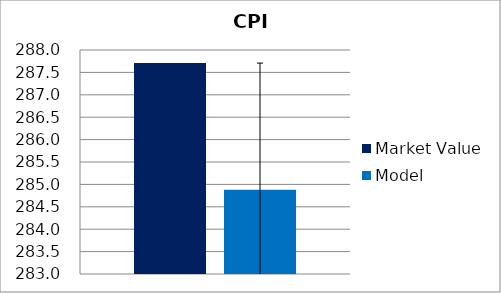
| Category | Market Value | Model |
|---|---|---|
| 0 | 287.708 | 284.88 |